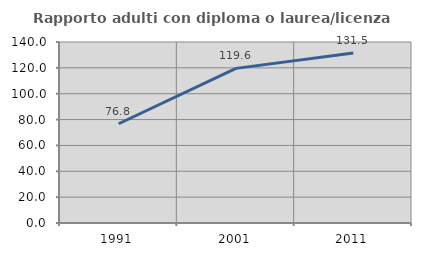
| Category | Rapporto adulti con diploma o laurea/licenza media  |
|---|---|
| 1991.0 | 76.774 |
| 2001.0 | 119.592 |
| 2011.0 | 131.461 |